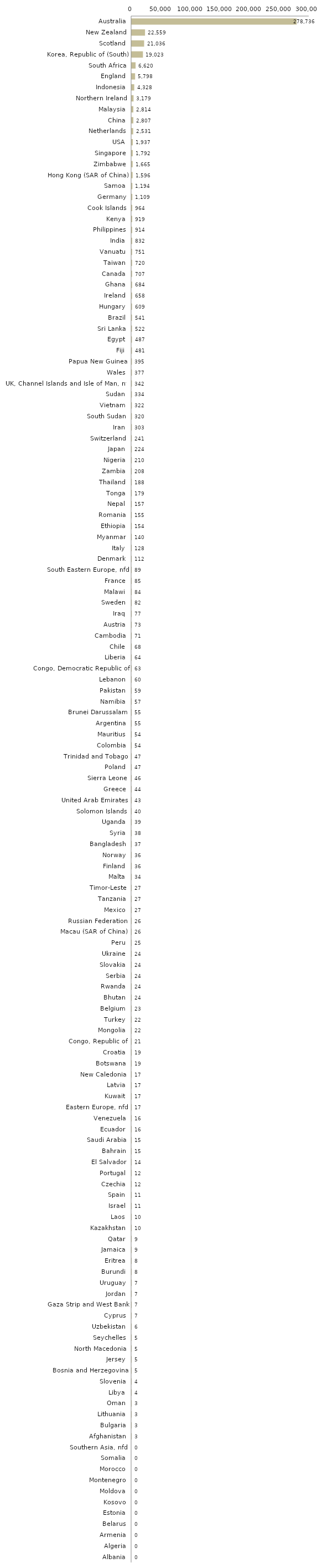
| Category | Series 0 |
|---|---|
| Australia | 278736 |
| New Zealand | 22559 |
| Scotland | 21036 |
| Korea, Republic of (South) | 19023 |
| South Africa | 6620 |
| England | 5798 |
| Indonesia | 4328 |
| Northern Ireland | 3179 |
| Malaysia | 2814 |
| China | 2807 |
| Netherlands | 2531 |
| USA | 1937 |
| Singapore | 1792 |
| Zimbabwe | 1665 |
| Hong Kong (SAR of China) | 1596 |
| Samoa | 1194 |
| Germany | 1109 |
| Cook Islands | 964 |
| Kenya | 919 |
| Philippines | 914 |
| India | 832 |
| Vanuatu | 751 |
| Taiwan | 720 |
| Canada | 707 |
| Ghana | 684 |
| Ireland | 658 |
| Hungary | 609 |
| Brazil | 541 |
| Sri Lanka | 522 |
| Egypt | 487 |
| Fiji | 481 |
| Papua New Guinea | 395 |
| Wales | 377 |
| UK, Channel Islands and Isle of Man, nfd | 342 |
| Sudan | 334 |
| Vietnam | 322 |
| South Sudan | 320 |
| Iran | 303 |
| Switzerland | 241 |
| Japan | 224 |
| Nigeria | 210 |
| Zambia | 208 |
| Thailand | 188 |
| Tonga | 179 |
| Nepal | 157 |
| Romania | 155 |
| Ethiopia | 154 |
| Myanmar | 140 |
| Italy | 128 |
| Denmark | 112 |
| South Eastern Europe, nfd | 89 |
| France | 85 |
| Malawi | 84 |
| Sweden | 82 |
| Iraq | 77 |
| Austria | 73 |
| Cambodia | 71 |
| Chile | 68 |
| Liberia | 64 |
| Congo, Democratic Republic of | 63 |
| Lebanon | 60 |
| Pakistan | 59 |
| Namibia | 57 |
| Brunei Darussalam | 55 |
| Argentina | 55 |
| Mauritius | 54 |
| Colombia | 54 |
| Trinidad and Tobago | 47 |
| Poland | 47 |
| Sierra Leone | 46 |
| Greece | 44 |
| United Arab Emirates | 43 |
| Solomon Islands | 40 |
| Uganda | 39 |
| Syria | 38 |
| Bangladesh | 37 |
| Norway | 36 |
| Finland | 36 |
| Malta | 34 |
| Timor-Leste | 27 |
| Tanzania | 27 |
| Mexico | 27 |
| Russian Federation | 26 |
| Macau (SAR of China) | 26 |
| Peru | 25 |
| Ukraine | 24 |
| Slovakia | 24 |
| Serbia | 24 |
| Rwanda | 24 |
| Bhutan | 24 |
| Belgium | 23 |
| Turkey | 22 |
| Mongolia | 22 |
| Congo, Republic of | 21 |
| Croatia | 19 |
| Botswana | 19 |
| New Caledonia | 17 |
| Latvia | 17 |
| Kuwait | 17 |
| Eastern Europe, nfd | 17 |
| Venezuela | 16 |
| Ecuador | 16 |
| Saudi Arabia | 15 |
| Bahrain | 15 |
| El Salvador | 14 |
| Portugal | 12 |
| Czechia | 12 |
| Spain | 11 |
| Israel | 11 |
| Laos | 10 |
| Kazakhstan | 10 |
| Qatar | 9 |
| Jamaica | 9 |
| Eritrea | 8 |
| Burundi | 8 |
| Uruguay | 7 |
| Jordan | 7 |
| Gaza Strip and West Bank | 7 |
| Cyprus | 7 |
| Uzbekistan | 6 |
| Seychelles | 5 |
| North Macedonia | 5 |
| Jersey | 5 |
| Bosnia and Herzegovina | 5 |
| Slovenia | 4 |
| Libya | 4 |
| Oman | 3 |
| Lithuania | 3 |
| Bulgaria | 3 |
| Afghanistan | 3 |
| Southern Asia, nfd | 0 |
| Somalia | 0 |
| Morocco | 0 |
| Montenegro | 0 |
| Moldova | 0 |
| Kosovo | 0 |
| Estonia | 0 |
| Belarus | 0 |
| Armenia | 0 |
| Algeria | 0 |
| Albania | 0 |